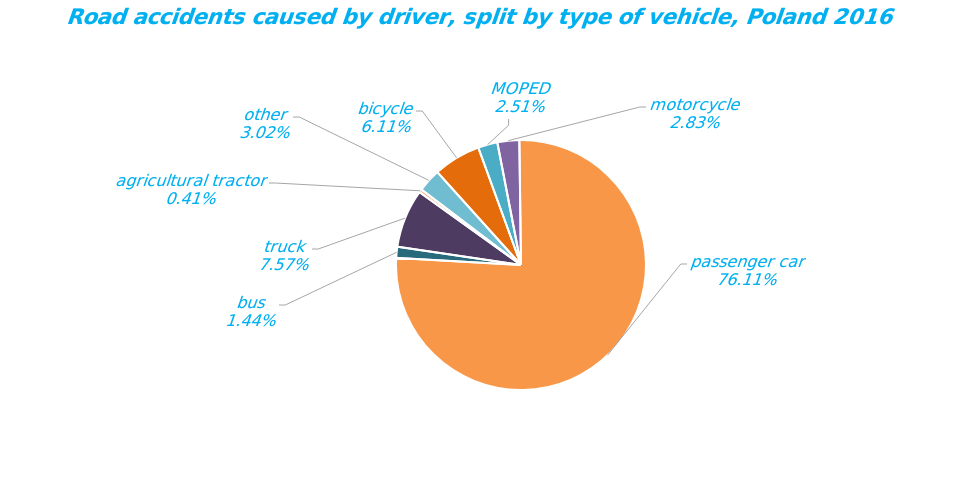
| Category | Series 0 |
|---|---|
| bicycle | 1778 |
| MOPED | 731 |
| motorcycle | 823 |
| passenger car | 22134 |
| bus | 419 |
| truck | 2201 |
| agricultural tractor | 118 |
| other | 877 |